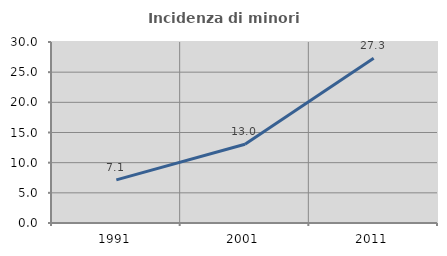
| Category | Incidenza di minori stranieri |
|---|---|
| 1991.0 | 7.143 |
| 2001.0 | 13.043 |
| 2011.0 | 27.292 |